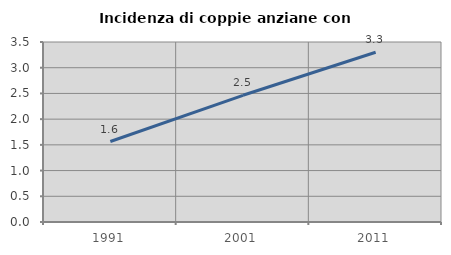
| Category | Incidenza di coppie anziane con figli |
|---|---|
| 1991.0 | 1.565 |
| 2001.0 | 2.464 |
| 2011.0 | 3.301 |